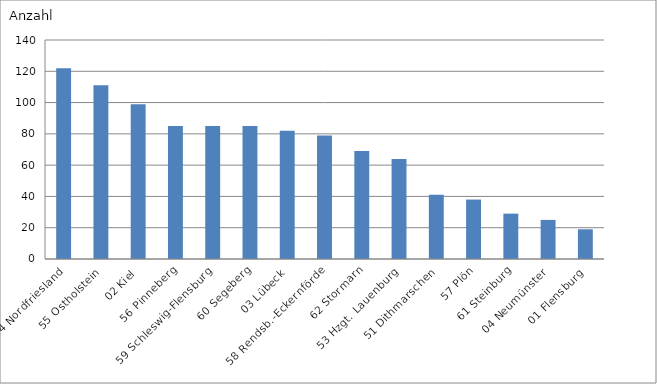
| Category | 54 Nordfriesland |
|---|---|
| 54 Nordfriesland | 122 |
| 55 Ostholstein | 111 |
| 02 Kiel | 99 |
| 56 Pinneberg | 85 |
| 59 Schleswig-Flensburg | 85 |
| 60 Segeberg | 85 |
| 03 Lübeck | 82 |
| 58 Rendsb.-Eckernförde | 79 |
| 62 Stormarn | 69 |
| 53 Hzgt. Lauenburg | 64 |
| 51 Dithmarschen | 41 |
| 57 Plön | 38 |
| 61 Steinburg | 29 |
| 04 Neumünster | 25 |
| 01 Flensburg | 19 |